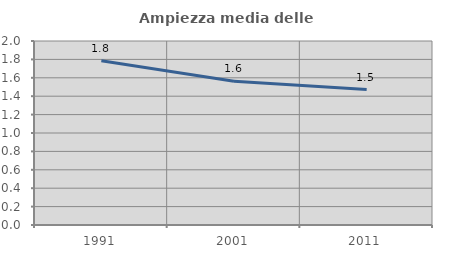
| Category | Ampiezza media delle famiglie |
|---|---|
| 1991.0 | 1.784 |
| 2001.0 | 1.562 |
| 2011.0 | 1.473 |